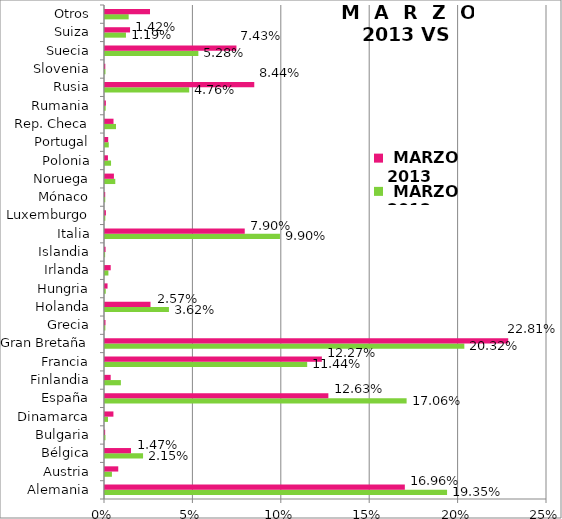
| Category |  MARZO 2012 |  MARZO 2013 |
|---|---|---|
| Alemania | 0.193 | 0.17 |
| Austria | 0.004 | 0.007 |
| Bélgica | 0.022 | 0.015 |
| Bulgaria | 0 | 0 |
| Dinamarca | 0.002 | 0.005 |
| España | 0.171 | 0.126 |
| Finlandia | 0.009 | 0.003 |
| Francia | 0.114 | 0.123 |
| Gran Bretaña | 0.203 | 0.228 |
| Grecia | 0 | 0 |
| Holanda | 0.036 | 0.026 |
| Hungria | 0 | 0.001 |
| Irlanda | 0.002 | 0.003 |
| Islandia | 0 | 0 |
| Italia | 0.099 | 0.079 |
| Luxemburgo | 0 | 0.001 |
| Mónaco | 0 | 0 |
| Noruega | 0.006 | 0.005 |
| Polonia | 0.003 | 0.002 |
| Portugal | 0.002 | 0.002 |
| Rep. Checa | 0.006 | 0.005 |
| Rumania | 0 | 0 |
| Rusia | 0.048 | 0.084 |
| Slovenia | 0 | 0 |
| Suecia | 0.053 | 0.074 |
| Suiza | 0.012 | 0.014 |
| Otros | 0.013 | 0.025 |